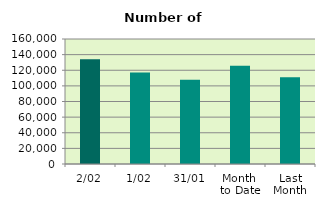
| Category | Series 0 |
|---|---|
| 2/02 | 134234 |
| 1/02 | 117230 |
| 31/01 | 107956 |
| Month 
to Date | 125732 |
| Last
Month | 111077.545 |